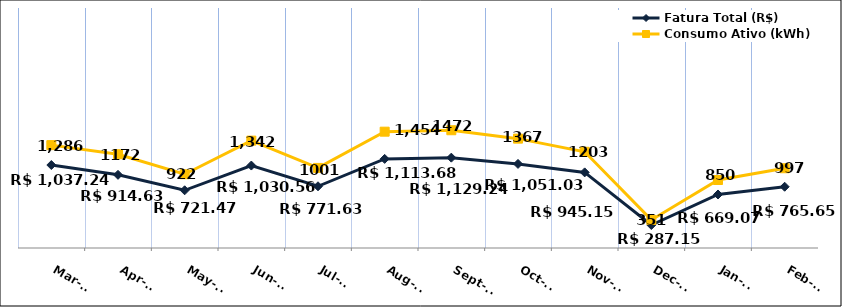
| Category | Fatura Total (R$) |
|---|---|
| 2023-03-01 | 1037.24 |
| 2023-04-01 | 914.63 |
| 2023-05-01 | 721.47 |
| 2023-06-01 | 1030.56 |
| 2023-07-01 | 771.63 |
| 2023-08-01 | 1113.68 |
| 2023-09-01 | 1129.24 |
| 2023-10-01 | 1051.03 |
| 2023-11-01 | 945.15 |
| 2023-12-01 | 287.15 |
| 2024-01-01 | 669.07 |
| 2024-02-01 | 765.65 |